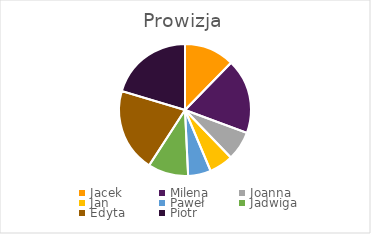
| Category | Prowizja |
|---|---|
| Jacek | 5367 |
| Milena | 8019 |
| Joanna | 3121 |
| Jan | 2568 |
| Paweł | 2436 |
| Jadwiga | 4324 |
| Edyta | 8949 |
| Piotr | 8901 |